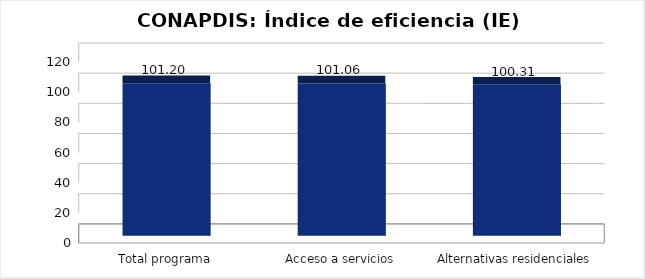
| Category | Índice de eficiencia (IE)  |
|---|---|
| Total programa | 101.198 |
| Acceso a servicios | 101.065 |
| Alternativas residenciales | 100.314 |